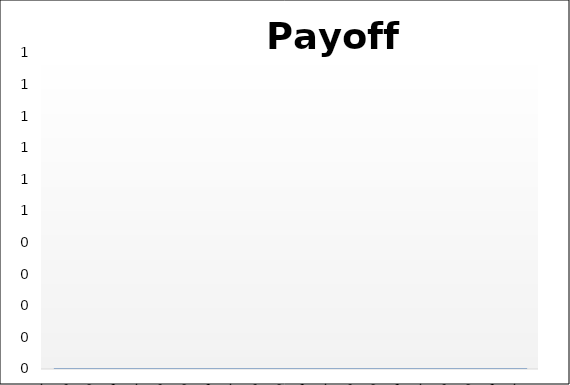
| Category | Net Payoff  |
|---|---|
| 1245.25 | 0 |
| 1267.225 | 0 |
| 1289.2 | 0 |
| 1311.175 | 0 |
| 1333.1499999999999 | 0 |
| 1355.125 | 0 |
| 1377.1 | 0 |
| 1399.0749999999998 | 0 |
| 1421.05 | 0 |
| 1443.0249999999999 | 0 |
| 1465.0 | 0 |
| 1486.975 | 0 |
| 1508.9499999999998 | 0 |
| 1530.9249999999997 | 0 |
| 1552.8999999999999 | 0 |
| 1574.8749999999998 | 0 |
| 1596.85 | 0 |
| 1618.8249999999998 | 0 |
| 1640.7999999999997 | 0 |
| 1662.7749999999999 | 0 |
| 1684.7499999999998 | 0 |